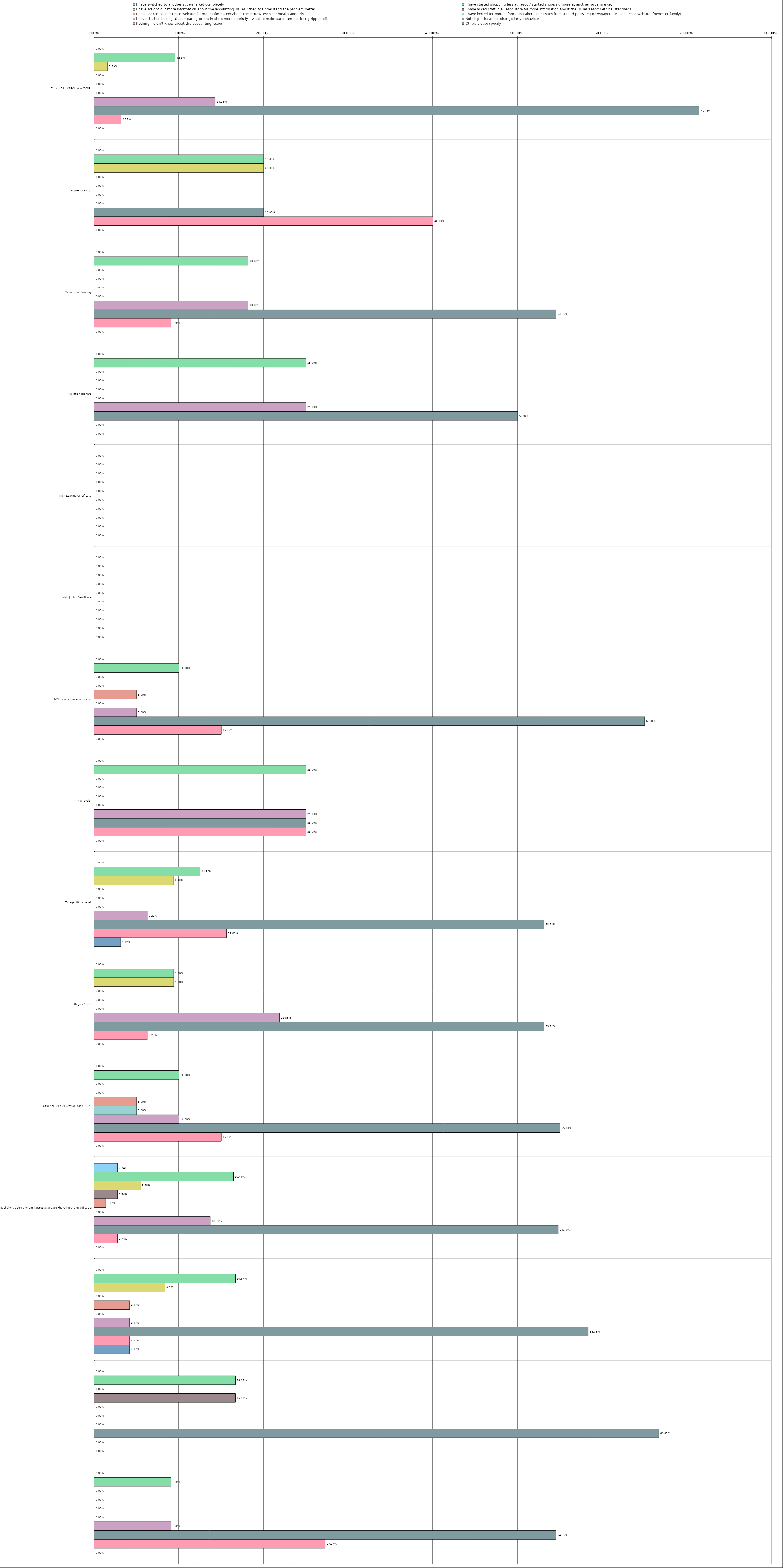
| Category | I have switched to another supermarket completely | I have started shopping less at Tesco / started shopping more at another supermarket | I have sought out more information about the accounting issues / tried to understand the problem better | I have asked staff in a Tesco store for more information about the issues/Tesco’s ethical standards | I have looked on the Tesco website for more information about the issues/Tesco’s ethical standards | I have looked for more information about the issues from a third party (eg newspaper, TV, non-Tesco website, friends or family) | I have started looking at /comparing prices in store more carefully – want to make sure I am not being ripped off | Nothing –  have not changed my behaviour | Nothing – didn’t know about the accounting issues | Other, please specify |
|---|---|---|---|---|---|---|---|---|---|---|
| 0 | 0 | 0.095 | 0.016 | 0 | 0 | 0 | 0.143 | 0.714 | 0.032 | 0 |
| 1 | 0 | 0.2 | 0.2 | 0 | 0 | 0 | 0 | 0.2 | 0.4 | 0 |
| 2 | 0 | 0.182 | 0 | 0 | 0 | 0 | 0.182 | 0.546 | 0.091 | 0 |
| 3 | 0 | 0.25 | 0 | 0 | 0 | 0 | 0.25 | 0.5 | 0 | 0 |
| 4 | 0 | 0 | 0 | 0 | 0 | 0 | 0 | 0 | 0 | 0 |
| 5 | 0 | 0 | 0 | 0 | 0 | 0 | 0 | 0 | 0 | 0 |
| 6 | 0 | 0.1 | 0 | 0 | 0.05 | 0 | 0.05 | 0.65 | 0.15 | 0 |
| 7 | 0 | 0.25 | 0 | 0 | 0 | 0 | 0.25 | 0.25 | 0.25 | 0 |
| 8 | 0 | 0.125 | 0.094 | 0 | 0 | 0 | 0.062 | 0.531 | 0.156 | 0.031 |
| 9 | 0 | 0.094 | 0.094 | 0 | 0 | 0 | 0.219 | 0.531 | 0.062 | 0 |
| 10 | 0 | 0.1 | 0 | 0 | 0.05 | 0.05 | 0.1 | 0.55 | 0.15 | 0 |
| 11 | 0.027 | 0.164 | 0.055 | 0.027 | 0.014 | 0 | 0.137 | 0.548 | 0.027 | 0 |
| 12 | 0 | 0.167 | 0.083 | 0 | 0.042 | 0 | 0.042 | 0.583 | 0.042 | 0.042 |
| 13 | 0 | 0.167 | 0 | 0.167 | 0 | 0 | 0 | 0.667 | 0 | 0 |
| 14 | 0 | 0.091 | 0 | 0 | 0 | 0 | 0.091 | 0.546 | 0.273 | 0 |